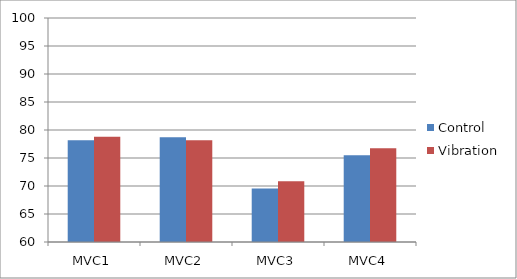
| Category | Control | Vibration |
|---|---|---|
| MVC1 | 78.186 | 78.774 |
| MVC2 | 78.718 | 78.166 |
| MVC3 | 69.545 | 70.868 |
| MVC4 | 75.5 | 76.756 |